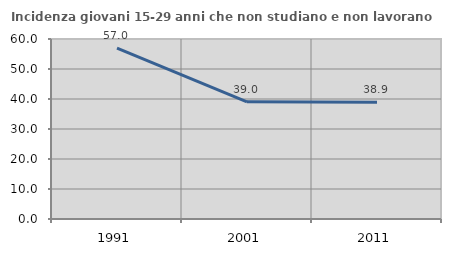
| Category | Incidenza giovani 15-29 anni che non studiano e non lavorano  |
|---|---|
| 1991.0 | 56.985 |
| 2001.0 | 39.048 |
| 2011.0 | 38.947 |